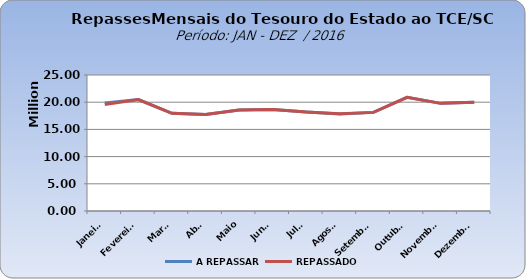
| Category | A REPASSAR | REPASSADO |
|---|---|---|
| Janeiro | 19837066.33 | 19573821.63 |
| Fevereiro | 20487570.02 | 20487570.02 |
| Março | 17958037.91 | 17958022.32 |
| Abril | 17726453.14 | 17726453.15 |
| Maio | 18557258.75 | 18557258.75 |
| Junho | 18656908.94 | 18656908.93 |
| Julho | 18193546.88 | 18193546.88 |
| Agosto | 17848868.86 | 17869091.28 |
| Setembro | 18128698.69 | 18128698.69 |
| Outubro | 20885631.25 | 20885631.25 |
| Novembro | 19784957.96 | 19784957.96 |
| Dezembro | 19980859.63 | 19980859.64 |